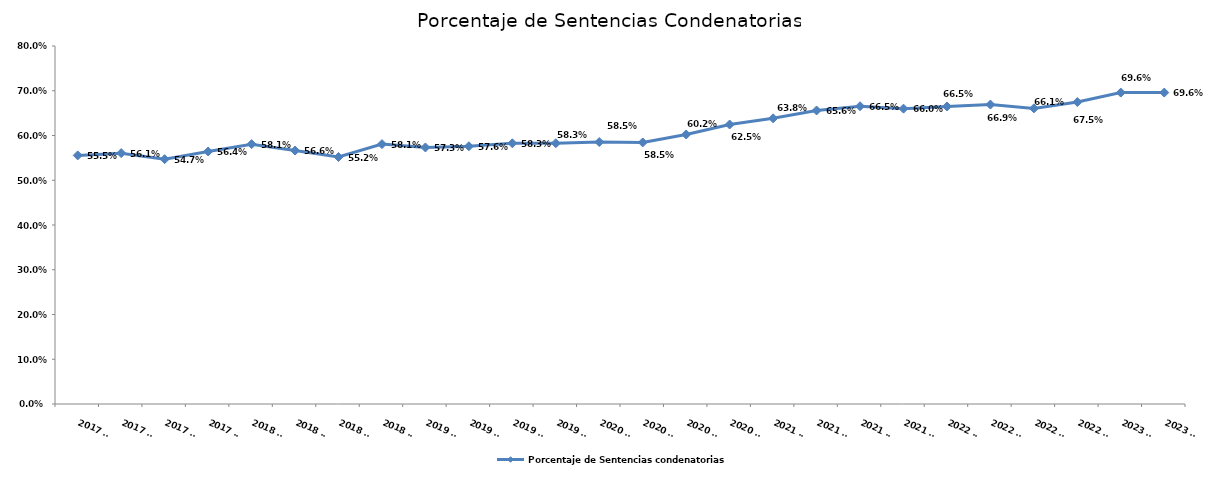
| Category | Porcentaje de Sentencias condenatorias |
|---|---|
| 2017 T1 | 0.555 |
| 2017 T2 | 0.561 |
| 2017 T3 | 0.547 |
| 2017 T4 | 0.564 |
| 2018 T1 | 0.581 |
| 2018 T2 | 0.566 |
| 2018 T3 | 0.552 |
| 2018 T4 | 0.581 |
| 2019 T1 | 0.573 |
| 2019 T2 | 0.576 |
| 2019 T3 | 0.583 |
| 2019 T4 | 0.583 |
| 2020 T1 | 0.585 |
| 2020 T2 | 0.585 |
| 2020 T3 | 0.602 |
| 2020 T4 | 0.625 |
| 2021 T1 | 0.638 |
| 2021 T2 | 0.656 |
| 2021 T3 | 0.665 |
| 2021 T4 | 0.66 |
| 2022 T1 | 0.665 |
| 2022 T2 | 0.669 |
| 2022 T3 | 0.661 |
| 2022 T4 | 0.675 |
| 2023 T1 | 0.696 |
| 2023 T2 | 0.696 |